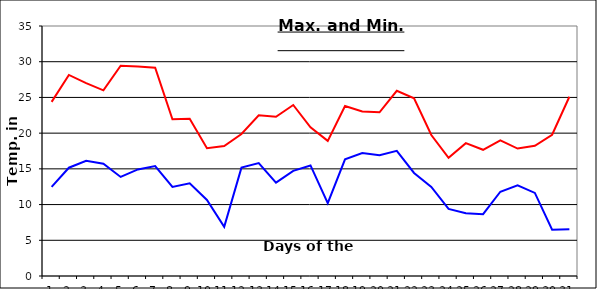
| Category | Series 0 | Series 1 |
|---|---|---|
| 0 | 24.38 | 12.48 |
| 1 | 28.15 | 15.16 |
| 2 | 27.01 | 16.13 |
| 3 | 25.99 | 15.71 |
| 4 | 29.44 | 13.87 |
| 5 | 29.32 | 14.92 |
| 6 | 29.15 | 15.39 |
| 7 | 21.94 | 12.48 |
| 8 | 22.01 | 12.98 |
| 9 | 17.9 | 10.64 |
| 10 | 18.2 | 6.88 |
| 11 | 19.88 | 15.17 |
| 12 | 22.49 | 15.81 |
| 13 | 22.3 | 13.08 |
| 14 | 23.94 | 14.72 |
| 15 | 20.82 | 15.48 |
| 16 | 18.92 | 10.2 |
| 17 | 23.8 | 16.34 |
| 18 | 23.02 | 17.22 |
| 19 | 22.92 | 16.92 |
| 20 | 25.93 | 17.53 |
| 21 | 24.88 | 14.43 |
| 22 | 19.74 | 12.47 |
| 23 | 16.54 | 9.4 |
| 24 | 18.6 | 8.79 |
| 25 | 17.67 | 8.65 |
| 26 | 18.98 | 11.8 |
| 27 | 17.84 | 12.7 |
| 28 | 18.23 | 11.63 |
| 29 | 19.77 | 6.47 |
| 30 | 25.1 | 6.55 |